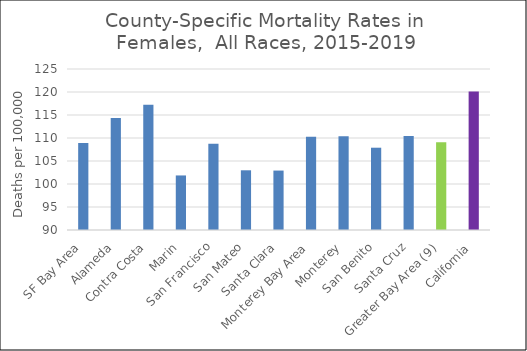
| Category | Female |
|---|---|
| SF Bay Area | 108.91 |
|   Alameda | 114.33 |
|   Contra Costa | 117.22 |
|   Marin | 101.86 |
|   San Francisco | 108.73 |
|   San Mateo | 102.98 |
|   Santa Clara | 102.92 |
| Monterey Bay Area | 110.29 |
|   Monterey | 110.4 |
|   San Benito | 107.89 |
|   Santa Cruz | 110.43 |
| Greater Bay Area (9) | 109.05 |
| California | 120.13 |